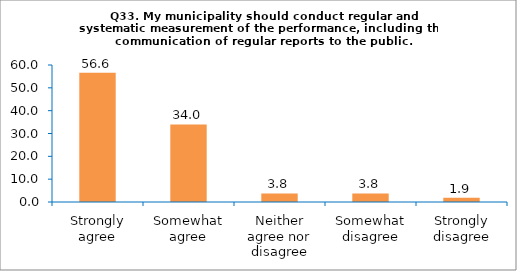
| Category | Series 0 |
|---|---|
| Strongly agree | 56.604 |
| Somewhat agree | 33.962 |
| Neither agree nor disagree | 3.774 |
| Somewhat disagree | 3.774 |
| Strongly disagree | 1.887 |